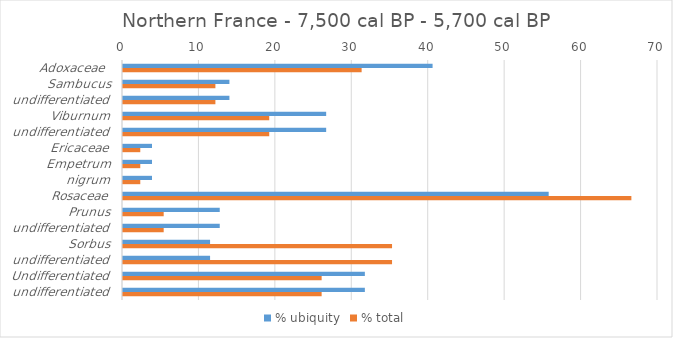
| Category | % ubiquity | % total |
|---|---|---|
| Adoxaceae  | 40.506 | 31.223 |
| Sambucus | 13.924 | 12.09 |
| undifferentiated | 13.924 | 12.09 |
| Viburnum | 26.582 | 19.133 |
| undifferentiated | 26.582 | 19.133 |
| Ericaceae | 3.797 | 2.261 |
| Empetrum | 3.797 | 2.261 |
| nigrum | 3.797 | 2.261 |
| Rosaceae | 55.696 | 66.516 |
| Prunus | 12.658 | 5.324 |
| undifferentiated | 12.658 | 5.324 |
| Sorbus | 11.392 | 35.202 |
| undifferentiated | 11.392 | 35.202 |
| Undifferentiated | 31.646 | 25.991 |
| undifferentiated | 31.646 | 25.991 |